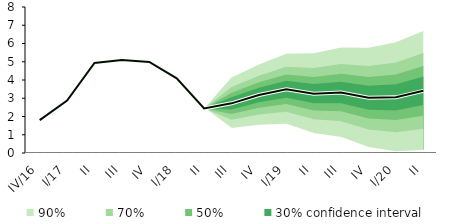
| Category | linka | Střed předpovědi |
|---|---|---|
| IV/16 | 1.804 | 1.804 |
| I/17 | 2.871 | 2.871 |
| II | 4.931 | 4.931 |
| III | 5.1 | 5.1 |
| IV | 4.988 | 4.988 |
| I/18 | 4.092 | 4.092 |
| II | 2.439 | 2.439 |
| III | 2.721 | 2.721 |
| IV | 3.176 | 3.176 |
| I/19 | 3.491 | 3.491 |
| II | 3.25 | 3.25 |
| III | 3.309 | 3.309 |
| IV | 3.026 | 3.026 |
| I/20 | 3.051 | 3.051 |
| II | 3.406 | 3.406 |